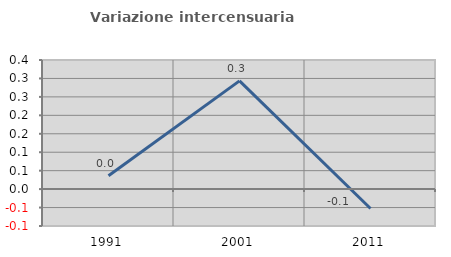
| Category | Variazione intercensuaria annua |
|---|---|
| 1991.0 | 0.036 |
| 2001.0 | 0.293 |
| 2011.0 | -0.053 |